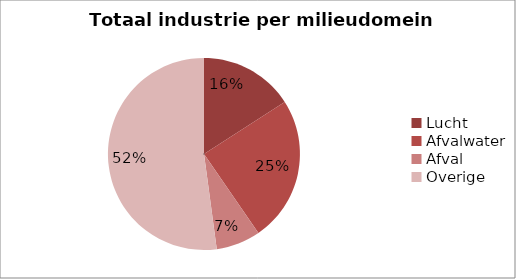
| Category | Series 0 |
|---|---|
| Lucht | 18.586 |
| Afvalwater | 28.659 |
| Afval | 8.727 |
| Overige | 60.945 |